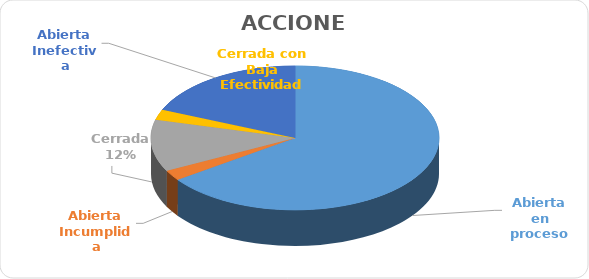
| Category | Series 0 |
|---|---|
| Abierta en proceso | 28 |
| Abierta Incumplida | 1 |
| Cerrada | 5 |
| Cerrada con Baja Efectividad | 1 |
| Abierta Inefectiva | 8 |